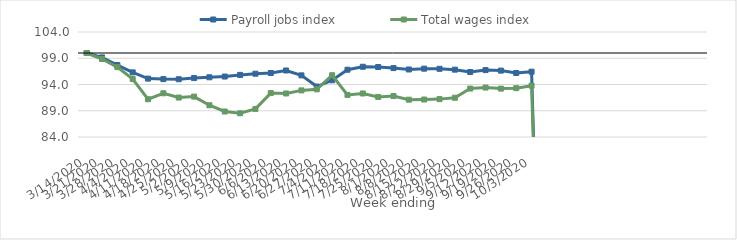
| Category | Payroll jobs index | Total wages index |
|---|---|---|
| 14/03/2020 | 100 | 100 |
| 21/03/2020 | 99.16 | 98.856 |
| 28/03/2020 | 97.706 | 97.311 |
| 04/04/2020 | 96.308 | 95.033 |
| 11/04/2020 | 95.122 | 91.194 |
| 18/04/2020 | 95.026 | 92.329 |
| 25/04/2020 | 95.002 | 91.511 |
| 02/05/2020 | 95.223 | 91.695 |
| 09/05/2020 | 95.376 | 90.046 |
| 16/05/2020 | 95.515 | 88.855 |
| 23/05/2020 | 95.83 | 88.52 |
| 30/05/2020 | 96.054 | 89.35 |
| 06/06/2020 | 96.193 | 92.361 |
| 13/06/2020 | 96.669 | 92.291 |
| 20/06/2020 | 95.74 | 92.879 |
| 27/06/2020 | 93.611 | 93.081 |
| 04/07/2020 | 94.804 | 95.766 |
| 11/07/2020 | 96.817 | 92.021 |
| 18/07/2020 | 97.381 | 92.288 |
| 25/07/2020 | 97.334 | 91.638 |
| 01/08/2020 | 97.126 | 91.793 |
| 08/08/2020 | 96.863 | 91.104 |
| 15/08/2020 | 97.016 | 91.14 |
| 22/08/2020 | 96.994 | 91.215 |
| 29/08/2020 | 96.829 | 91.476 |
| 05/09/2020 | 96.374 | 93.225 |
| 12/09/2020 | 96.739 | 93.417 |
| 19/09/2020 | 96.645 | 93.217 |
| 26/09/2020 | 96.192 | 93.301 |
| 03/10/2020 | 96.445 | 93.778 |